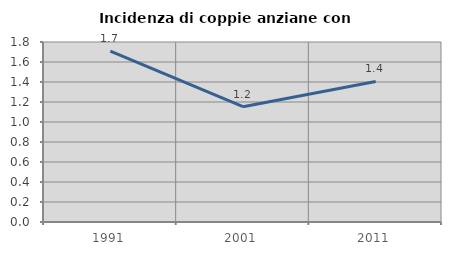
| Category | Incidenza di coppie anziane con figli |
|---|---|
| 1991.0 | 1.709 |
| 2001.0 | 1.153 |
| 2011.0 | 1.406 |